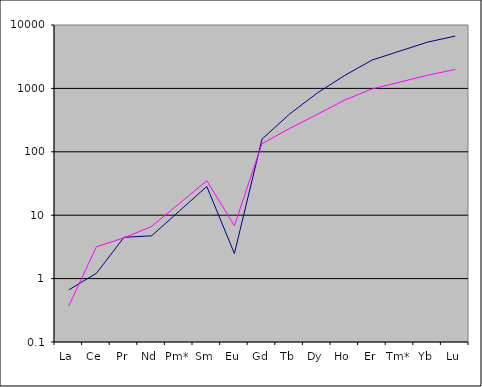
| Category | Series 0 | Series 1 |
|---|---|---|
| La | 0.664 | 0.371 |
| Ce | 1.213 | 3.171 |
| Pr | 4.482 | 4.396 |
| Nd | 4.728 | 6.644 |
| Pm* | 11.586 | 15.24 |
| Sm | 28.39 | 34.96 |
| Eu | 2.486 | 6.833 |
| Gd | 158.429 | 134.41 |
| Tb | 393.805 | 233.192 |
| Dy | 843.911 | 389.211 |
| Ho | 1604.17 | 656.082 |
| Er | 2812.305 | 983.511 |
| Tm* | 3885.635 | 1258.524 |
| Yb | 5368.607 | 1610.437 |
| Lu | 6681.579 | 1994.862 |